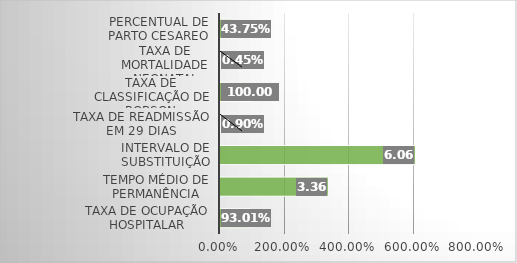
| Category | Series 0 |
|---|---|
| Taxa de Ocupação Hospitalar | 0.93 |
| Tempo Médio de permanência | 3.36 |
| Intervalo de substituição | 6.06 |
| Taxa de readmissão em 29 dias | 0.009 |
| Taxa de classificação de Robson | 1 |
| Taxa de mortalidade neonatal | 0.004 |
| Percentual de parto cesareo | 0.438 |